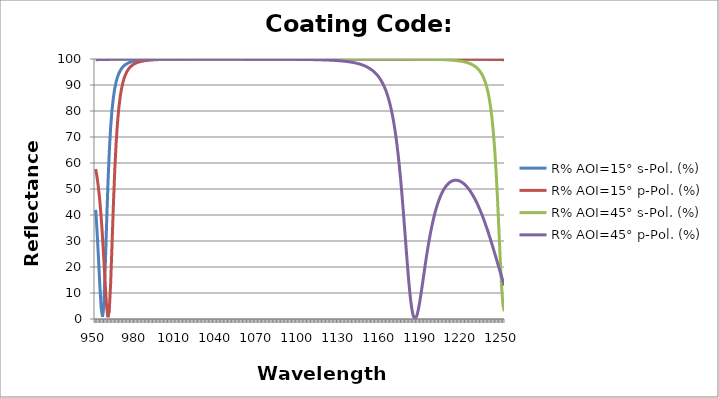
| Category | R% AOI=15° s-Pol. (%) | R% AOI=15° p-Pol. (%) | R% AOI=45° s-Pol. (%) | R% AOI=45° p-Pol. (%) |
|---|---|---|---|---|
| 950.0 | 41.986 | 57.676 | 99.997 | 99.739 |
| 951.0 | 33.789 | 54.596 | 99.998 | 99.755 |
| 952.0 | 23.998 | 50.653 | 99.998 | 99.77 |
| 953.0 | 13.424 | 45.66 | 99.998 | 99.783 |
| 954.0 | 4.379 | 39.419 | 99.998 | 99.796 |
| 955.0 | 0.819 | 31.794 | 99.998 | 99.807 |
| 956.0 | 6.16 | 22.881 | 99.998 | 99.818 |
| 957.0 | 19.626 | 13.358 | 99.998 | 99.828 |
| 958.0 | 36.443 | 4.971 | 99.998 | 99.837 |
| 959.0 | 52.064 | 0.684 | 99.998 | 99.845 |
| 960.0 | 64.523 | 3.458 | 99.998 | 99.853 |
| 961.0 | 73.763 | 13.739 | 99.998 | 99.86 |
| 962.0 | 80.423 | 28.56 | 99.998 | 99.867 |
| 963.0 | 85.199 | 43.894 | 99.998 | 99.873 |
| 964.0 | 88.647 | 57.165 | 99.998 | 99.879 |
| 965.0 | 91.166 | 67.601 | 99.998 | 99.884 |
| 966.0 | 93.032 | 75.438 | 99.998 | 99.889 |
| 967.0 | 94.435 | 81.219 | 99.998 | 99.894 |
| 968.0 | 95.503 | 85.476 | 99.999 | 99.898 |
| 969.0 | 96.329 | 88.631 | 99.999 | 99.902 |
| 970.0 | 96.974 | 90.994 | 99.999 | 99.906 |
| 971.0 | 97.485 | 92.781 | 99.999 | 99.91 |
| 972.0 | 97.892 | 94.15 | 99.999 | 99.913 |
| 973.0 | 98.22 | 95.212 | 99.999 | 99.916 |
| 974.0 | 98.487 | 96.044 | 99.999 | 99.919 |
| 975.0 | 98.706 | 96.703 | 99.999 | 99.922 |
| 976.0 | 98.887 | 97.231 | 99.999 | 99.925 |
| 977.0 | 99.037 | 97.658 | 99.999 | 99.927 |
| 978.0 | 99.163 | 98.005 | 99.999 | 99.929 |
| 979.0 | 99.269 | 98.29 | 99.999 | 99.932 |
| 980.0 | 99.358 | 98.526 | 99.999 | 99.934 |
| 981.0 | 99.435 | 98.723 | 99.999 | 99.936 |
| 982.0 | 99.5 | 98.888 | 99.999 | 99.937 |
| 983.0 | 99.556 | 99.027 | 99.999 | 99.939 |
| 984.0 | 99.605 | 99.145 | 99.999 | 99.941 |
| 985.0 | 99.647 | 99.246 | 99.999 | 99.942 |
| 986.0 | 99.684 | 99.332 | 99.999 | 99.944 |
| 987.0 | 99.716 | 99.406 | 99.999 | 99.945 |
| 988.0 | 99.744 | 99.47 | 99.999 | 99.946 |
| 989.0 | 99.768 | 99.526 | 99.999 | 99.948 |
| 990.0 | 99.79 | 99.574 | 99.999 | 99.949 |
| 991.0 | 99.809 | 99.617 | 99.999 | 99.95 |
| 992.0 | 99.826 | 99.654 | 99.999 | 99.951 |
| 993.0 | 99.841 | 99.686 | 99.999 | 99.952 |
| 994.0 | 99.855 | 99.715 | 99.999 | 99.953 |
| 995.0 | 99.867 | 99.741 | 99.999 | 99.954 |
| 996.0 | 99.878 | 99.764 | 99.999 | 99.955 |
| 997.0 | 99.887 | 99.784 | 99.999 | 99.955 |
| 998.0 | 99.896 | 99.802 | 99.999 | 99.956 |
| 999.0 | 99.904 | 99.818 | 99.999 | 99.957 |
| 1000.0 | 99.911 | 99.833 | 99.999 | 99.957 |
| 1001.0 | 99.918 | 99.846 | 99.999 | 99.958 |
| 1002.0 | 99.924 | 99.858 | 99.999 | 99.959 |
| 1003.0 | 99.929 | 99.868 | 99.999 | 99.959 |
| 1004.0 | 99.934 | 99.878 | 99.999 | 99.96 |
| 1005.0 | 99.938 | 99.887 | 99.999 | 99.96 |
| 1006.0 | 99.942 | 99.895 | 99.999 | 99.961 |
| 1007.0 | 99.946 | 99.902 | 99.999 | 99.961 |
| 1008.0 | 99.949 | 99.908 | 99.999 | 99.961 |
| 1009.0 | 99.952 | 99.914 | 99.999 | 99.962 |
| 1010.0 | 99.955 | 99.92 | 99.999 | 99.962 |
| 1011.0 | 99.958 | 99.925 | 99.999 | 99.962 |
| 1012.0 | 99.96 | 99.93 | 99.999 | 99.963 |
| 1013.0 | 99.963 | 99.934 | 99.999 | 99.963 |
| 1014.0 | 99.965 | 99.938 | 99.999 | 99.963 |
| 1015.0 | 99.967 | 99.941 | 99.999 | 99.963 |
| 1016.0 | 99.968 | 99.945 | 99.999 | 99.964 |
| 1017.0 | 99.97 | 99.948 | 99.999 | 99.964 |
| 1018.0 | 99.972 | 99.951 | 99.999 | 99.964 |
| 1019.0 | 99.973 | 99.953 | 99.999 | 99.964 |
| 1020.0 | 99.974 | 99.956 | 99.999 | 99.964 |
| 1021.0 | 99.976 | 99.958 | 99.999 | 99.964 |
| 1022.0 | 99.977 | 99.96 | 99.999 | 99.964 |
| 1023.0 | 99.978 | 99.962 | 99.999 | 99.964 |
| 1024.0 | 99.979 | 99.964 | 99.999 | 99.964 |
| 1025.0 | 99.98 | 99.966 | 99.999 | 99.964 |
| 1026.0 | 99.981 | 99.967 | 99.999 | 99.964 |
| 1027.0 | 99.982 | 99.969 | 99.999 | 99.964 |
| 1028.0 | 99.982 | 99.97 | 99.999 | 99.964 |
| 1029.0 | 99.983 | 99.971 | 99.999 | 99.964 |
| 1030.0 | 99.984 | 99.973 | 99.999 | 99.964 |
| 1031.0 | 99.984 | 99.974 | 99.999 | 99.964 |
| 1032.0 | 99.985 | 99.975 | 99.999 | 99.964 |
| 1033.0 | 99.986 | 99.976 | 99.999 | 99.964 |
| 1034.0 | 99.986 | 99.977 | 99.999 | 99.963 |
| 1035.0 | 99.987 | 99.978 | 99.999 | 99.963 |
| 1036.0 | 99.987 | 99.978 | 99.999 | 99.963 |
| 1037.0 | 99.988 | 99.979 | 99.999 | 99.963 |
| 1038.0 | 99.988 | 99.98 | 99.999 | 99.962 |
| 1039.0 | 99.988 | 99.981 | 99.999 | 99.962 |
| 1040.0 | 99.989 | 99.981 | 99.999 | 99.962 |
| 1041.0 | 99.989 | 99.982 | 99.999 | 99.962 |
| 1042.0 | 99.99 | 99.983 | 99.999 | 99.961 |
| 1043.0 | 99.99 | 99.983 | 99.999 | 99.961 |
| 1044.0 | 99.99 | 99.984 | 99.999 | 99.96 |
| 1045.0 | 99.99 | 99.984 | 99.999 | 99.96 |
| 1046.0 | 99.991 | 99.985 | 99.999 | 99.96 |
| 1047.0 | 99.991 | 99.985 | 99.999 | 99.959 |
| 1048.0 | 99.991 | 99.986 | 99.999 | 99.959 |
| 1049.0 | 99.991 | 99.986 | 99.999 | 99.958 |
| 1050.0 | 99.992 | 99.986 | 99.999 | 99.958 |
| 1051.0 | 99.992 | 99.987 | 99.999 | 99.957 |
| 1052.0 | 99.992 | 99.987 | 99.999 | 99.956 |
| 1053.0 | 99.992 | 99.987 | 99.999 | 99.956 |
| 1054.0 | 99.992 | 99.988 | 99.999 | 99.955 |
| 1055.0 | 99.993 | 99.988 | 99.999 | 99.954 |
| 1056.0 | 99.993 | 99.988 | 99.999 | 99.954 |
| 1057.0 | 99.993 | 99.989 | 99.999 | 99.953 |
| 1058.0 | 99.993 | 99.989 | 99.999 | 99.952 |
| 1059.0 | 99.993 | 99.989 | 99.999 | 99.951 |
| 1060.0 | 99.993 | 99.989 | 99.999 | 99.95 |
| 1061.0 | 99.994 | 99.99 | 99.999 | 99.949 |
| 1062.0 | 99.994 | 99.99 | 99.999 | 99.948 |
| 1063.0 | 99.994 | 99.99 | 99.999 | 99.947 |
| 1064.0 | 99.994 | 99.99 | 99.999 | 99.946 |
| 1065.0 | 99.994 | 99.99 | 99.999 | 99.945 |
| 1066.0 | 99.994 | 99.99 | 99.999 | 99.944 |
| 1067.0 | 99.994 | 99.991 | 99.999 | 99.943 |
| 1068.0 | 99.994 | 99.991 | 99.999 | 99.941 |
| 1069.0 | 99.994 | 99.991 | 99.999 | 99.94 |
| 1070.0 | 99.994 | 99.991 | 99.999 | 99.939 |
| 1071.0 | 99.995 | 99.991 | 99.999 | 99.937 |
| 1072.0 | 99.995 | 99.991 | 99.999 | 99.936 |
| 1073.0 | 99.995 | 99.992 | 99.999 | 99.934 |
| 1074.0 | 99.995 | 99.992 | 99.999 | 99.932 |
| 1075.0 | 99.995 | 99.992 | 99.999 | 99.93 |
| 1076.0 | 99.995 | 99.992 | 99.999 | 99.929 |
| 1077.0 | 99.995 | 99.992 | 99.999 | 99.927 |
| 1078.0 | 99.995 | 99.992 | 99.999 | 99.925 |
| 1079.0 | 99.995 | 99.992 | 99.999 | 99.923 |
| 1080.0 | 99.995 | 99.992 | 99.999 | 99.92 |
| 1081.0 | 99.995 | 99.992 | 99.999 | 99.918 |
| 1082.0 | 99.995 | 99.992 | 99.999 | 99.916 |
| 1083.0 | 99.995 | 99.992 | 99.999 | 99.913 |
| 1084.0 | 99.995 | 99.993 | 99.999 | 99.91 |
| 1085.0 | 99.995 | 99.993 | 99.999 | 99.907 |
| 1086.0 | 99.995 | 99.993 | 99.999 | 99.904 |
| 1087.0 | 99.995 | 99.993 | 99.999 | 99.901 |
| 1088.0 | 99.996 | 99.993 | 99.999 | 99.898 |
| 1089.0 | 99.996 | 99.993 | 99.999 | 99.895 |
| 1090.0 | 99.996 | 99.993 | 99.998 | 99.891 |
| 1091.0 | 99.996 | 99.993 | 99.998 | 99.887 |
| 1092.0 | 99.996 | 99.993 | 99.998 | 99.883 |
| 1093.0 | 99.996 | 99.993 | 99.998 | 99.879 |
| 1094.0 | 99.996 | 99.993 | 99.998 | 99.874 |
| 1095.0 | 99.996 | 99.993 | 99.998 | 99.87 |
| 1096.0 | 99.996 | 99.993 | 99.998 | 99.865 |
| 1097.0 | 99.996 | 99.993 | 99.998 | 99.86 |
| 1098.0 | 99.996 | 99.993 | 99.998 | 99.854 |
| 1099.0 | 99.996 | 99.993 | 99.998 | 99.848 |
| 1100.0 | 99.996 | 99.993 | 99.998 | 99.842 |
| 1101.0 | 99.996 | 99.993 | 99.998 | 99.835 |
| 1102.0 | 99.996 | 99.993 | 99.998 | 99.828 |
| 1103.0 | 99.996 | 99.993 | 99.998 | 99.821 |
| 1104.0 | 99.996 | 99.993 | 99.998 | 99.814 |
| 1105.0 | 99.996 | 99.993 | 99.998 | 99.805 |
| 1106.0 | 99.996 | 99.993 | 99.998 | 99.797 |
| 1107.0 | 99.996 | 99.993 | 99.998 | 99.788 |
| 1108.0 | 99.996 | 99.993 | 99.998 | 99.778 |
| 1109.0 | 99.996 | 99.993 | 99.998 | 99.767 |
| 1110.0 | 99.996 | 99.993 | 99.998 | 99.756 |
| 1111.0 | 99.996 | 99.993 | 99.998 | 99.745 |
| 1112.0 | 99.996 | 99.993 | 99.997 | 99.732 |
| 1113.0 | 99.996 | 99.993 | 99.997 | 99.719 |
| 1114.0 | 99.996 | 99.993 | 99.997 | 99.705 |
| 1115.0 | 99.996 | 99.993 | 99.997 | 99.69 |
| 1116.0 | 99.996 | 99.993 | 99.997 | 99.673 |
| 1117.0 | 99.996 | 99.993 | 99.997 | 99.656 |
| 1118.0 | 99.996 | 99.993 | 99.997 | 99.638 |
| 1119.0 | 99.996 | 99.993 | 99.997 | 99.618 |
| 1120.0 | 99.996 | 99.993 | 99.997 | 99.597 |
| 1121.0 | 99.996 | 99.993 | 99.997 | 99.574 |
| 1122.0 | 99.996 | 99.993 | 99.996 | 99.55 |
| 1123.0 | 99.996 | 99.993 | 99.996 | 99.524 |
| 1124.0 | 99.995 | 99.993 | 99.996 | 99.496 |
| 1125.0 | 99.995 | 99.993 | 99.996 | 99.466 |
| 1126.0 | 99.995 | 99.993 | 99.996 | 99.433 |
| 1127.0 | 99.995 | 99.993 | 99.996 | 99.398 |
| 1128.0 | 99.995 | 99.993 | 99.996 | 99.36 |
| 1129.0 | 99.995 | 99.992 | 99.996 | 99.319 |
| 1130.0 | 99.995 | 99.992 | 99.995 | 99.275 |
| 1131.0 | 99.995 | 99.992 | 99.995 | 99.227 |
| 1132.0 | 99.995 | 99.992 | 99.995 | 99.176 |
| 1133.0 | 99.995 | 99.992 | 99.995 | 99.119 |
| 1134.0 | 99.995 | 99.992 | 99.995 | 99.058 |
| 1135.0 | 99.995 | 99.992 | 99.994 | 98.992 |
| 1136.0 | 99.995 | 99.992 | 99.994 | 98.919 |
| 1137.0 | 99.995 | 99.992 | 99.994 | 98.84 |
| 1138.0 | 99.995 | 99.992 | 99.994 | 98.754 |
| 1139.0 | 99.995 | 99.992 | 99.993 | 98.659 |
| 1140.0 | 99.995 | 99.992 | 99.993 | 98.556 |
| 1141.0 | 99.995 | 99.991 | 99.993 | 98.442 |
| 1142.0 | 99.994 | 99.991 | 99.993 | 98.317 |
| 1143.0 | 99.994 | 99.991 | 99.992 | 98.179 |
| 1144.0 | 99.994 | 99.991 | 99.992 | 98.028 |
| 1145.0 | 99.994 | 99.991 | 99.992 | 97.86 |
| 1146.0 | 99.994 | 99.991 | 99.991 | 97.675 |
| 1147.0 | 99.994 | 99.991 | 99.991 | 97.469 |
| 1148.0 | 99.994 | 99.99 | 99.99 | 97.24 |
| 1149.0 | 99.994 | 99.99 | 99.99 | 96.986 |
| 1150.0 | 99.994 | 99.99 | 99.99 | 96.702 |
| 1151.0 | 99.994 | 99.99 | 99.989 | 96.385 |
| 1152.0 | 99.994 | 99.99 | 99.988 | 96.042 |
| 1153.0 | 99.994 | 99.99 | 99.988 | 95.664 |
| 1154.0 | 99.994 | 99.99 | 99.988 | 95.242 |
| 1155.0 | 99.993 | 99.989 | 99.987 | 94.768 |
| 1156.0 | 99.993 | 99.989 | 99.986 | 94.236 |
| 1157.0 | 99.993 | 99.989 | 99.986 | 93.636 |
| 1158.0 | 99.993 | 99.989 | 99.985 | 92.958 |
| 1159.0 | 99.993 | 99.989 | 99.984 | 92.191 |
| 1160.0 | 99.993 | 99.988 | 99.984 | 91.32 |
| 1161.0 | 99.993 | 99.988 | 99.983 | 90.33 |
| 1162.0 | 99.993 | 99.988 | 99.982 | 89.202 |
| 1163.0 | 99.992 | 99.988 | 99.981 | 87.913 |
| 1164.0 | 99.992 | 99.988 | 99.98 | 86.438 |
| 1165.0 | 99.992 | 99.987 | 99.979 | 84.747 |
| 1166.0 | 99.992 | 99.987 | 99.978 | 82.805 |
| 1167.0 | 99.992 | 99.987 | 99.977 | 80.574 |
| 1168.0 | 99.992 | 99.986 | 99.976 | 78.01 |
| 1169.0 | 99.992 | 99.986 | 99.974 | 75.065 |
| 1170.0 | 99.991 | 99.986 | 99.973 | 71.689 |
| 1171.0 | 99.991 | 99.986 | 99.972 | 67.831 |
| 1172.0 | 99.991 | 99.985 | 99.97 | 63.445 |
| 1173.0 | 99.991 | 99.985 | 99.968 | 58.498 |
| 1174.0 | 99.991 | 99.985 | 99.967 | 52.981 |
| 1175.0 | 99.99 | 99.984 | 99.965 | 46.917 |
| 1176.0 | 99.99 | 99.984 | 99.963 | 40.386 |
| 1177.0 | 99.99 | 99.984 | 99.961 | 33.535 |
| 1178.0 | 99.99 | 99.983 | 99.958 | 26.584 |
| 1179.0 | 99.99 | 99.983 | 99.956 | 19.832 |
| 1180.0 | 99.989 | 99.982 | 99.953 | 13.624 |
| 1181.0 | 99.989 | 99.982 | 99.951 | 8.312 |
| 1182.0 | 99.989 | 99.982 | 99.948 | 4.197 |
| 1183.0 | 99.988 | 99.981 | 99.944 | 1.477 |
| 1184.0 | 99.988 | 99.98 | 99.941 | 0.214 |
| 1185.0 | 99.988 | 99.98 | 99.937 | 0.331 |
| 1186.0 | 99.988 | 99.979 | 99.933 | 1.644 |
| 1187.0 | 99.987 | 99.979 | 99.929 | 3.906 |
| 1188.0 | 99.987 | 99.978 | 99.924 | 6.851 |
| 1189.0 | 99.987 | 99.978 | 99.919 | 10.23 |
| 1190.0 | 99.986 | 99.977 | 99.914 | 13.834 |
| 1191.0 | 99.986 | 99.976 | 99.908 | 17.497 |
| 1192.0 | 99.985 | 99.976 | 99.902 | 21.098 |
| 1193.0 | 99.985 | 99.975 | 99.895 | 24.555 |
| 1194.0 | 99.985 | 99.974 | 99.887 | 27.816 |
| 1195.0 | 99.984 | 99.974 | 99.879 | 30.853 |
| 1196.0 | 99.984 | 99.973 | 99.87 | 33.652 |
| 1197.0 | 99.983 | 99.972 | 99.861 | 36.212 |
| 1198.0 | 99.983 | 99.971 | 99.85 | 38.538 |
| 1199.0 | 99.982 | 99.97 | 99.839 | 40.641 |
| 1200.0 | 99.982 | 99.969 | 99.826 | 42.533 |
| 1201.0 | 99.981 | 99.968 | 99.813 | 44.227 |
| 1202.0 | 99.98 | 99.967 | 99.798 | 45.737 |
| 1203.0 | 99.98 | 99.966 | 99.782 | 47.076 |
| 1204.0 | 99.979 | 99.965 | 99.764 | 48.256 |
| 1205.0 | 99.979 | 99.964 | 99.744 | 49.289 |
| 1206.0 | 99.978 | 99.962 | 99.722 | 50.186 |
| 1207.0 | 99.977 | 99.961 | 99.698 | 50.955 |
| 1208.0 | 99.976 | 99.96 | 99.672 | 51.606 |
| 1209.0 | 99.976 | 99.958 | 99.642 | 52.146 |
| 1210.0 | 99.975 | 99.957 | 99.61 | 52.581 |
| 1211.0 | 99.974 | 99.955 | 99.573 | 52.918 |
| 1212.0 | 99.973 | 99.953 | 99.533 | 53.161 |
| 1213.0 | 99.972 | 99.952 | 99.488 | 53.315 |
| 1214.0 | 99.971 | 99.95 | 99.438 | 53.384 |
| 1215.0 | 99.97 | 99.948 | 99.382 | 53.372 |
| 1216.0 | 99.969 | 99.946 | 99.319 | 53.28 |
| 1217.0 | 99.968 | 99.944 | 99.247 | 53.112 |
| 1218.0 | 99.967 | 99.942 | 99.167 | 52.868 |
| 1219.0 | 99.965 | 99.939 | 99.076 | 52.552 |
| 1220.0 | 99.964 | 99.937 | 98.973 | 52.164 |
| 1221.0 | 99.963 | 99.934 | 98.855 | 51.706 |
| 1222.0 | 99.961 | 99.931 | 98.721 | 51.177 |
| 1223.0 | 99.96 | 99.928 | 98.567 | 50.579 |
| 1224.0 | 99.958 | 99.925 | 98.39 | 49.912 |
| 1225.0 | 99.956 | 99.922 | 98.186 | 49.177 |
| 1226.0 | 99.954 | 99.919 | 97.949 | 48.374 |
| 1227.0 | 99.953 | 99.915 | 97.673 | 47.503 |
| 1228.0 | 99.951 | 99.911 | 97.35 | 46.564 |
| 1229.0 | 99.948 | 99.908 | 96.97 | 45.558 |
| 1230.0 | 99.946 | 99.903 | 96.522 | 44.484 |
| 1231.0 | 99.944 | 99.899 | 95.989 | 43.345 |
| 1232.0 | 99.942 | 99.894 | 95.352 | 42.14 |
| 1233.0 | 99.939 | 99.889 | 94.586 | 40.87 |
| 1234.0 | 99.936 | 99.884 | 93.659 | 39.536 |
| 1235.0 | 99.933 | 99.878 | 92.529 | 38.142 |
| 1236.0 | 99.93 | 99.872 | 91.141 | 36.688 |
| 1237.0 | 99.927 | 99.866 | 89.426 | 35.177 |
| 1238.0 | 99.924 | 99.859 | 87.29 | 33.613 |
| 1239.0 | 99.92 | 99.852 | 84.612 | 31.999 |
| 1240.0 | 99.916 | 99.844 | 81.236 | 30.341 |
| 1241.0 | 99.912 | 99.836 | 76.963 | 28.643 |
| 1242.0 | 99.908 | 99.828 | 71.554 | 26.912 |
| 1243.0 | 99.903 | 99.818 | 64.747 | 25.156 |
| 1244.0 | 99.899 | 99.809 | 56.316 | 23.381 |
| 1245.0 | 99.893 | 99.798 | 46.199 | 21.598 |
| 1246.0 | 99.888 | 99.787 | 34.724 | 19.814 |
| 1247.0 | 99.882 | 99.775 | 22.88 | 18.042 |
| 1248.0 | 99.876 | 99.762 | 12.4 | 16.292 |
| 1249.0 | 99.869 | 99.748 | 5.311 | 14.575 |
| 1250.0 | 99.862 | 99.734 | 2.978 | 12.904 |